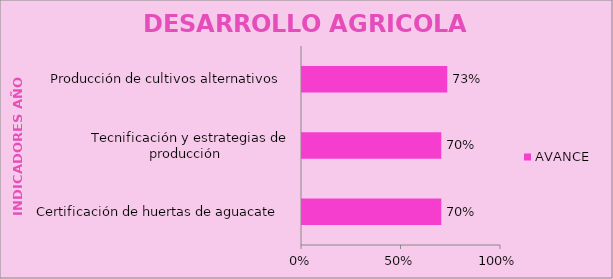
| Category | AVANCE  |
|---|---|
| Certificación de huertas de aguacate  | 0.7 |
| Tecnificación y estrategias de producción   | 0.7 |
| Producción de cultivos alternativos  | 0.73 |